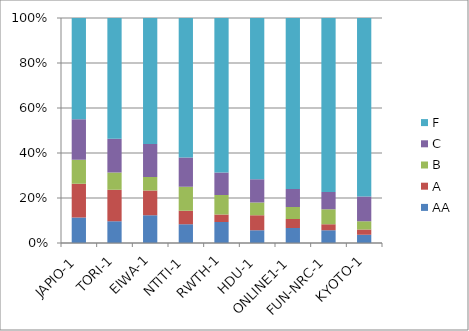
| Category | AA | A | B | C | F |
|---|---|---|---|---|---|
| _x0007_JAPIO-1 | 34 | 45 | 32 | 54 | 135 |
| _x0006_TORI-1 | 29 | 42 | 23 | 45 | 161 |
| _x0006_EIWA-1 | 37 | 33 | 18 | 44 | 168 |
| _x0007_NTITI-1 | 25 | 18 | 32 | 39 | 186 |
| _x0006_RWTH-1 | 28 | 10 | 26 | 30 | 206 |
| _x0005_HDU-1 | 17 | 20 | 17 | 31 | 215 |
| 	ONLINE1-1 | 20 | 12 | 16 | 24 | 228 |
| 	FUN-NRC-1 | 17 | 8 | 20 | 23 | 232 |
| _x0007_KYOTO-1 | 11 | 7 | 11 | 33 | 238 |